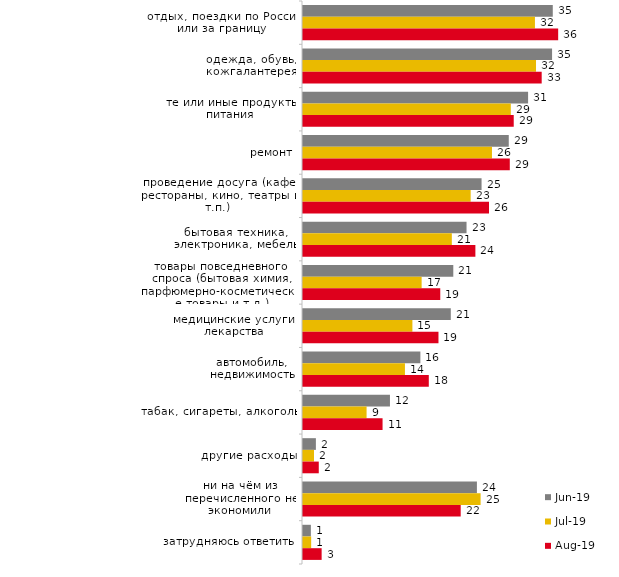
| Category | июн.19 | июл.19 | авг.19 |
|---|---|---|---|
| отдых, поездки по России или за границу | 34.813 | 32.327 | 35.564 |
| одежда, обувь, кожгалантерея | 34.713 | 32.475 | 33.267 |
| те или иные продукты питания | 31.372 | 28.96 | 29.371 |
| ремонт | 28.678 | 26.337 | 28.821 |
| проведение досуга (кафе, рестораны, кино, театры и т.п.) | 24.888 | 23.366 | 25.924 |
| бытовая техника, электроника, мебель | 22.793 | 20.743 | 24.026 |
| товары повседневного спроса (бытовая химия, парфюмерно-косметические товары и т.д.) | 20.948 | 16.535 | 19.131 |
| медицинские услуги, лекарства | 20.599 | 15.248 | 18.881 |
| автомобиль, недвижимость | 16.359 | 14.208 | 17.532 |
| табак, сигареты, алкоголь | 12.12 | 8.861 | 11.089 |
| другие расходы | 1.796 | 1.535 | 2.198 |
| ни на чём из перечисленного не экономили | 24.239 | 24.752 | 21.978 |
| затрудняюсь ответить | 1.097 | 1.139 | 2.597 |